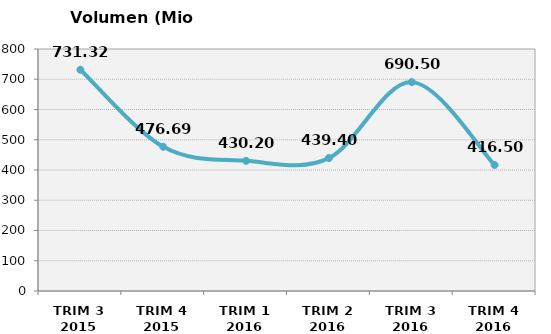
| Category | Volumen (Mio consumiciones) |
|---|---|
| TRIM 3 2015 | 731.324 |
| TRIM 4 2015 | 476.687 |
| TRIM 1 2016 | 430.2 |
| TRIM 2 2016 | 439.4 |
| TRIM 3 2016 | 690.5 |
| TRIM 4 2016 | 416.5 |